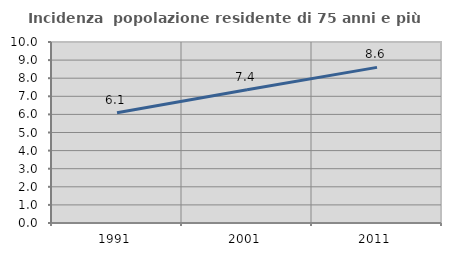
| Category | Incidenza  popolazione residente di 75 anni e più |
|---|---|
| 1991.0 | 6.088 |
| 2001.0 | 7.36 |
| 2011.0 | 8.598 |